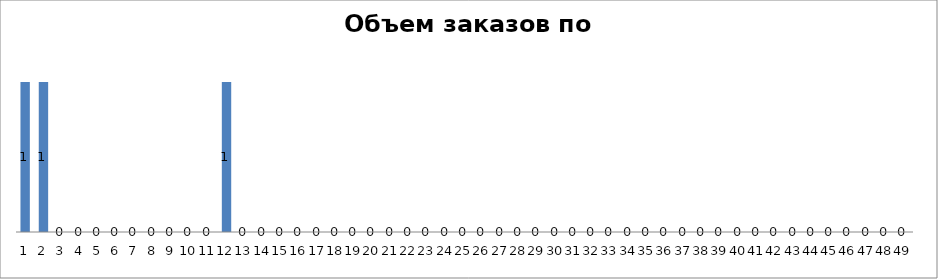
| Category | Series 0 |
|---|---|
| 0 | 1 |
| 1 | 1 |
| 2 | 0 |
| 3 | 0 |
| 4 | 0 |
| 5 | 0 |
| 6 | 0 |
| 7 | 0 |
| 8 | 0 |
| 9 | 0 |
| 10 | 0 |
| 11 | 1 |
| 12 | 0 |
| 13 | 0 |
| 14 | 0 |
| 15 | 0 |
| 16 | 0 |
| 17 | 0 |
| 18 | 0 |
| 19 | 0 |
| 20 | 0 |
| 21 | 0 |
| 22 | 0 |
| 23 | 0 |
| 24 | 0 |
| 25 | 0 |
| 26 | 0 |
| 27 | 0 |
| 28 | 0 |
| 29 | 0 |
| 30 | 0 |
| 31 | 0 |
| 32 | 0 |
| 33 | 0 |
| 34 | 0 |
| 35 | 0 |
| 36 | 0 |
| 37 | 0 |
| 38 | 0 |
| 39 | 0 |
| 40 | 0 |
| 41 | 0 |
| 42 | 0 |
| 43 | 0 |
| 44 | 0 |
| 45 | 0 |
| 46 | 0 |
| 47 | 0 |
| 48 | 0 |